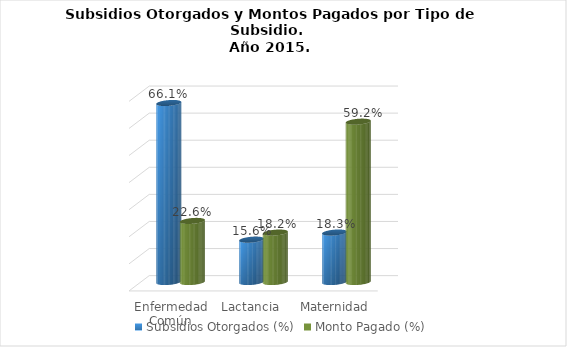
| Category | Subsidios Otorgados (%) | Monto Pagado (%) |
|---|---|---|
| Enfermedad Común | 0.661 | 0.226 |
| Lactancia  | 0.156 | 0.182 |
| Maternidad | 0.183 | 0.592 |